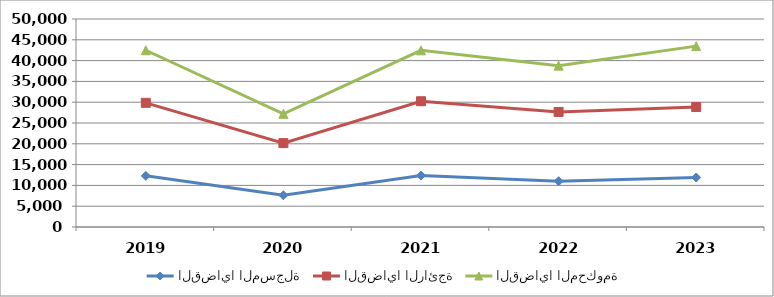
| Category | القضايا المسجلة | القضايا الرائجة | القضايا المحكومة |
|---|---|---|---|
| 2019.0 | 12297 | 17555 | 12639 |
| 2020.0 | 7628 | 12544 | 7035 |
| 2021.0 | 12361 | 17870 | 12236 |
| 2022.0 | 11011 | 16647 | 11129 |
| 2023.0 | 11895 | 16950 | 14635 |